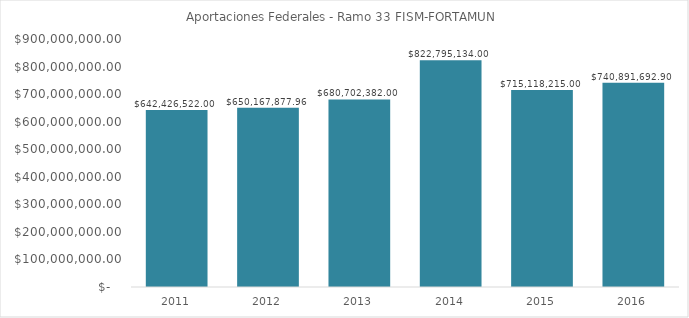
| Category | Aportaciones Federales - Ramo 33 FISM-FORTAMUN |
|---|---|
| 2011.0 | 642426522 |
| 2012.0 | 650167877.96 |
| 2013.0 | 680702382 |
| 2014.0 | 822795134 |
| 2015.0 | 715118215 |
| 2016.0 | 740891692.9 |